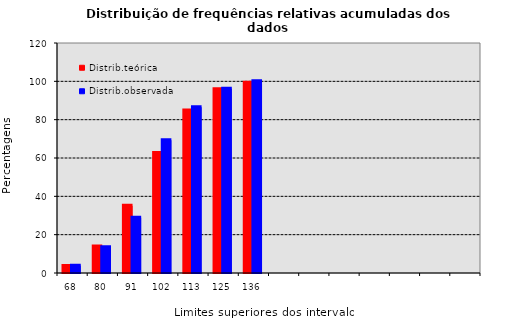
| Category |  Distrib.teórica |  Distrib.observada |
|---|---|---|
| 68,28571429 | 3.636 | 3.846 |
| 79,57142857 | 13.801 | 13.462 |
| 90,85714286 | 35.052 | 28.846 |
| 102,1428571 | 62.606 | 69.231 |
| 113,4285714 | 84.774 | 86.538 |
| 124,7142857 | 95.838 | 96.154 |
| 136 | 99.261 | 100 |